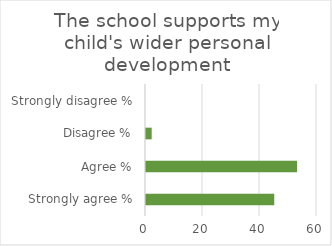
| Category | Series 1 |
|---|---|
| Strongly agree % | 45 |
| Agree % | 53 |
| Disagree % | 2 |
| Strongly disagree % | 0 |